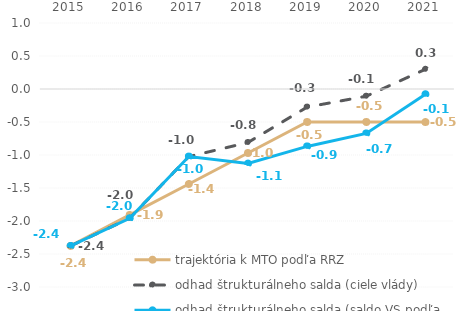
| Category | trajektória k MTO podľa RRZ | odhad štrukturálneho salda (ciele vlády) | odhad štrukturálneho salda (saldo VS podľa RRZ) |
|---|---|---|---|
| 2015.0 | -2.378 | -2.378 | -2.378 |
| 2016.0 | -1.908 | -1.958 | -1.958 |
| 2017.0 | -1.439 | -1.024 | -1.024 |
| 2018.0 | -0.969 | -0.81 | -1.129 |
| 2019.0 | -0.5 | -0.274 | -0.87 |
| 2020.0 | -0.5 | -0.109 | -0.673 |
| 2021.0 | -0.5 | 0.299 | -0.079 |